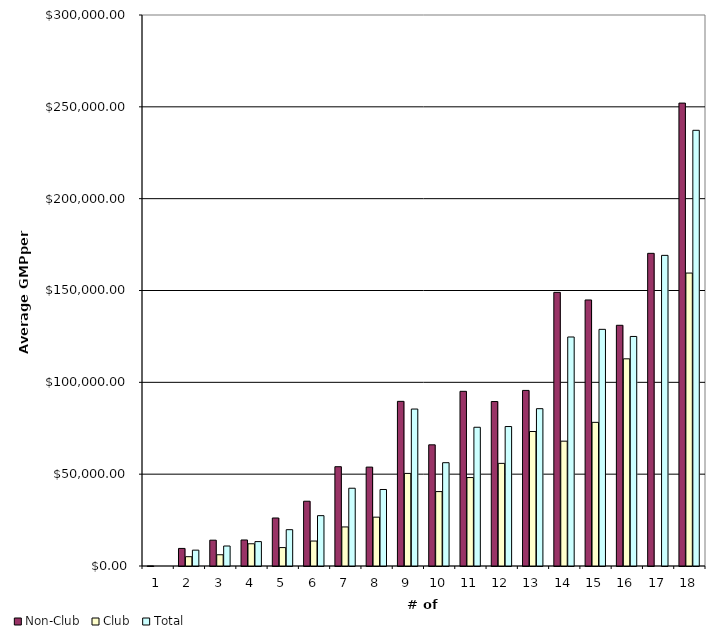
| Category | Non-Club | Club | Total |
|---|---|---|---|
| 1.0 | 9.073 | 0 | 0 |
| 2.0 | 9569.111 | 5062.128 | 8630.156 |
| 3.0 | 14062.307 | 6120.878 | 10885.735 |
| 4.0 | 14170.247 | 12099.019 | 13282.578 |
| 5.0 | 26141.434 | 10028.534 | 19771.218 |
| 6.0 | 35263.503 | 13590.59 | 27416.414 |
| 7.0 | 54056.194 | 21267.678 | 42346.01 |
| 8.0 | 53849.037 | 26589.284 | 41653.884 |
| 9.0 | 89647.559 | 50409.576 | 85455.467 |
| 10.0 | 65981.11 | 40512.131 | 56242.971 |
| 11.0 | 95105.113 | 48154.586 | 75542.393 |
| 12.0 | 89540.948 | 55877.803 | 75932.443 |
| 13.0 | 95596.262 | 73229.015 | 85655.263 |
| 14.0 | 148994.2 | 67972.04 | 124687.552 |
| 15.0 | 144850.763 | 78207.552 | 128856.392 |
| 16.0 | 131059.999 | 112803.363 | 124974.454 |
| 17.0 | 170231.764 | 0 | 169128.35 |
| 18.0 | 252029.238 | 159495.748 | 237217.772 |